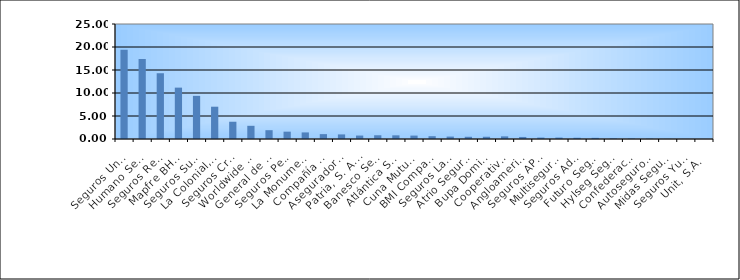
| Category | Series 0 |
|---|---|
| Seguros Universal, S. A. | 19.399 |
| Humano Seguros, S. A. | 17.388 |
| Seguros Reservas, S. A. | 14.297 |
| Mapfre BHD Compañía de Seguros | 11.168 |
| Seguros Sura, S.A. | 9.38 |
| La Colonial, S. A., Compañia De Seguros | 7.02 |
| Seguros Crecer, S. A. | 3.75 |
| Worldwide Seguros, S. A. | 2.867 |
| General de Seguros, S. A. | 1.915 |
| Seguros Pepín, S. A. | 1.595 |
| La Monumental de Seguros, S. A. | 1.43 |
| Compañía Dominicana de Seguros, C. por A. | 1.058 |
| Aseguradora Agropecuaria Dominicana, S. A. | 0.997 |
| Patria, S. A., Compañía de Seguros | 0.748 |
| Banesco Seguros | 0.812 |
| Atlántica Seguros, S. A. | 0.795 |
| Cuna Mutual Insurance Society Dominicana | 0.741 |
| BMI Compañía de Seguros, S. A. | 0.612 |
| Seguros La Internacional, S. A. | 0.528 |
| Atrio Seguros S. A. | 0.482 |
| Bupa Dominicana, S. A. | 0.488 |
| Cooperativa Nacional De Seguros, Inc  | 0.571 |
| Angloamericana de Seguros, S. A. | 0.443 |
| Seguros APS, S.R.L. | 0.312 |
| Multiseguros Su, S.A. | 0.311 |
| Seguros Ademi, S.A. | 0.268 |
| Futuro Seguros | 0.247 |
| Hylseg Seguros S.A | 0.128 |
| Confederación del Canadá Dominicana, S. A. | 0.101 |
| Autoseguro, S. A. | 0.077 |
| Midas Seguros, S.A. | 0.032 |
| Seguros Yunen, S.A. | 0.022 |
| Unit, S.A. | 0.016 |